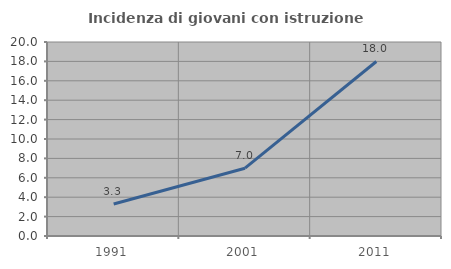
| Category | Incidenza di giovani con istruzione universitaria |
|---|---|
| 1991.0 | 3.297 |
| 2001.0 | 6.989 |
| 2011.0 | 17.992 |